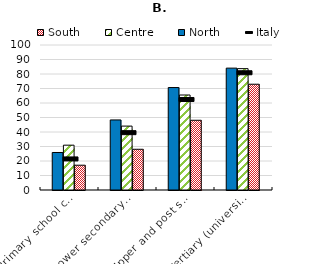
| Category | North | Centre | South |
|---|---|---|---|
| Primary school certificate, no educational degree | 25.872 | 30.91 | 17.095 |
| Lower secondary school certificate | 48.314 | 44.067 | 28.087 |
| Upper and post secondary | 70.651 | 65.512 | 48.092 |
| Tertiary (university, doctoral and specialization courses) | 84.05 | 83.686 | 72.95 |